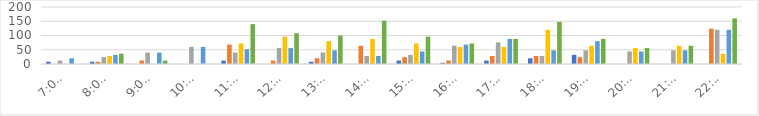
| Category | Series 0 | Series 1 | Series 2 | Series 3 | Series 4 | Series 5 |
|---|---|---|---|---|---|---|
| 7:00-8:00 | 8 | 0 | 12 | 0 | 20 | 0 |
| 8:00-9:00 | 8 | 8 | 24 | 28 | 32 | 36 |
| 9:00-10:00 | 0 | 12 | 40 | 0 | 40 | 12 |
| 10:00-11:00 | 0 | 0 | 60 | 0 | 60 | 0 |
| 11:00-12:00 | 12 | 68 | 40 | 72 | 52 | 140 |
| 12:00-13:00 | 0 | 12 | 56 | 96 | 56 | 108 |
| 13:00-14:00 | 8 | 20 | 40 | 80 | 48 | 100 |
| 14:00-15:00 | 0 | 64 | 28 | 88 | 28 | 152 |
| 15:00-16:00 | 12 | 24 | 32 | 72 | 44 | 96 |
| 16:00-17:00 | 4 | 12 | 64 | 60 | 68 | 72 |
| 17:00-18:00 | 12 | 28 | 76 | 60 | 88 | 88 |
| 18:00-19:00 | 20 | 28 | 28 | 120 | 48 | 148 |
| 19:00-20:00 | 32 | 24 | 48 | 64 | 80 | 88 |
| 20:00-21:00 | 0 | 0 | 44 | 56 | 44 | 56 |
| 21:00-22:00 | 0 | 0 | 48 | 64 | 48 | 64 |
| 22:00-23:00 | 0 | 124 | 120 | 36 | 120 | 160 |